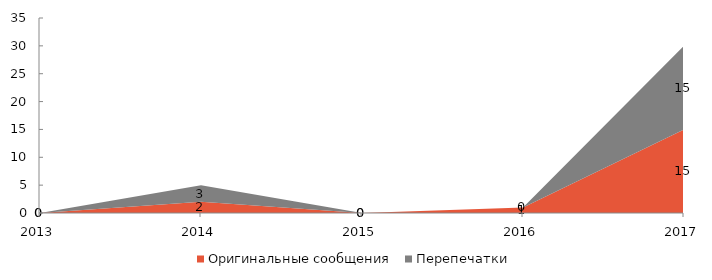
| Category | Оригинальные сообщения | Перепечатки |
|---|---|---|
| 2013 | 0 | 0 |
| 2014 | 2 | 3 |
| 2015 | 0 | 0 |
| 2016 | 1 | 0 |
| 2017 | 15 | 15 |